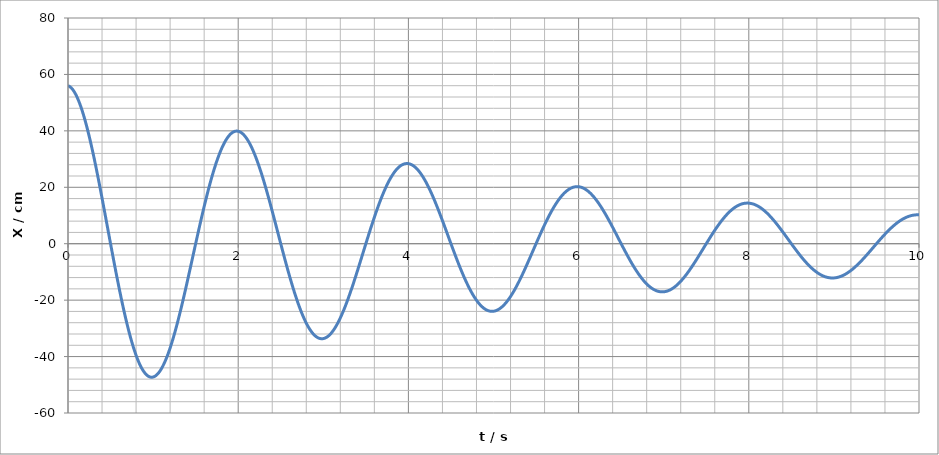
| Category | Series 0 |
|---|---|
| 0.0 | 56 |
| 0.01 | 55.877 |
| 0.02 | 55.7 |
| 0.03 | 55.468 |
| 0.04 | 55.182 |
| 0.05 | 54.842 |
| 0.06 | 54.45 |
| 0.07 | 54.005 |
| 0.08 | 53.508 |
| 0.09 | 52.96 |
| 0.1 | 52.361 |
| 0.11 | 51.713 |
| 0.12 | 51.016 |
| 0.13 | 50.271 |
| 0.14 | 49.479 |
| 0.15 | 48.64 |
| 0.16 | 47.756 |
| 0.17 | 46.828 |
| 0.18 | 45.857 |
| 0.19 | 44.844 |
| 0.2 | 43.79 |
| 0.21 | 42.697 |
| 0.22 | 41.565 |
| 0.23 | 40.395 |
| 0.24 | 39.19 |
| 0.25 | 37.95 |
| 0.26 | 36.677 |
| 0.27 | 35.372 |
| 0.28 | 34.036 |
| 0.29 | 32.672 |
| 0.3 | 31.279 |
| 0.31 | 29.861 |
| 0.32 | 28.418 |
| 0.33 | 26.951 |
| 0.34 | 25.463 |
| 0.35 | 23.955 |
| 0.36 | 22.428 |
| 0.37 | 20.884 |
| 0.38 | 19.325 |
| 0.39 | 17.752 |
| 0.4 | 16.167 |
| 0.41 | 14.572 |
| 0.42 | 12.967 |
| 0.43 | 11.355 |
| 0.44 | 9.737 |
| 0.45 | 8.115 |
| 0.46 | 6.491 |
| 0.47 | 4.865 |
| 0.48 | 3.241 |
| 0.49 | 1.618 |
| 0.5 | 0 |
| 0.51 | -1.613 |
| 0.52 | -3.219 |
| 0.53 | -4.816 |
| 0.54 | -6.403 |
| 0.55 | -7.978 |
| 0.56 | -9.54 |
| 0.57 | -11.088 |
| 0.58 | -12.619 |
| 0.59 | -14.132 |
| 0.6 | -15.627 |
| 0.61 | -17.101 |
| 0.62 | -18.553 |
| 0.63 | -19.981 |
| 0.64 | -21.386 |
| 0.65 | -22.764 |
| 0.66 | -24.115 |
| 0.67 | -25.438 |
| 0.68 | -26.731 |
| 0.69 | -27.993 |
| 0.7 | -29.223 |
| 0.71 | -30.42 |
| 0.72 | -31.583 |
| 0.73 | -32.711 |
| 0.74 | -33.803 |
| 0.75 | -34.858 |
| 0.76 | -35.875 |
| 0.77 | -36.852 |
| 0.78 | -37.79 |
| 0.79 | -38.688 |
| 0.8 | -39.544 |
| 0.81 | -40.358 |
| 0.82 | -41.13 |
| 0.83 | -41.858 |
| 0.84 | -42.543 |
| 0.85 | -43.183 |
| 0.86 | -43.778 |
| 0.87 | -44.328 |
| 0.88 | -44.833 |
| 0.89 | -45.291 |
| 0.9 | -45.703 |
| 0.91 | -46.069 |
| 0.92 | -46.388 |
| 0.93 | -46.659 |
| 0.94 | -46.884 |
| 0.95 | -47.062 |
| 0.96 | -47.193 |
| 0.97 | -47.276 |
| 0.98 | -47.313 |
| 0.99 | -47.302 |
| 1.0 | -47.245 |
| 1.01 | -47.142 |
| 1.02 | -46.992 |
| 1.03 | -46.796 |
| 1.04 | -46.555 |
| 1.05 | -46.269 |
| 1.06 | -45.937 |
| 1.07 | -45.562 |
| 1.08 | -45.143 |
| 1.09 | -44.68 |
| 1.1 | -44.175 |
| 1.11 | -43.629 |
| 1.12 | -43.04 |
| 1.13 | -42.412 |
| 1.14 | -41.743 |
| 1.15 | -41.036 |
| 1.16 | -40.29 |
| 1.17 | -39.508 |
| 1.18 | -38.688 |
| 1.19 | -37.834 |
| 1.2 | -36.944 |
| 1.21 | -36.022 |
| 1.22 | -35.067 |
| 1.23 | -34.08 |
| 1.24 | -33.063 |
| 1.25 | -32.017 |
| 1.26 | -30.943 |
| 1.27 | -29.842 |
| 1.28 | -28.715 |
| 1.29 | -27.564 |
| 1.3 | -26.389 |
| 1.31 | -25.193 |
| 1.32 | -23.975 |
| 1.33 | -22.738 |
| 1.34 | -21.482 |
| 1.35 | -20.21 |
| 1.36 | -18.922 |
| 1.37 | -17.619 |
| 1.38 | -16.304 |
| 1.39 | -14.977 |
| 1.4 | -13.64 |
| 1.41 | -12.294 |
| 1.42 | -10.94 |
| 1.43 | -9.58 |
| 1.44 | -8.215 |
| 1.45 | -6.846 |
| 1.46 | -5.476 |
| 1.47 | -4.105 |
| 1.48 | -2.734 |
| 1.49 | -1.365 |
| 1.5 | 0 |
| 1.51 | 1.361 |
| 1.52 | 2.716 |
| 1.53 | 4.063 |
| 1.54 | 5.402 |
| 1.55 | 6.731 |
| 1.56 | 8.049 |
| 1.57 | 9.354 |
| 1.58 | 10.646 |
| 1.59 | 11.923 |
| 1.6 | 13.184 |
| 1.61 | 14.427 |
| 1.62 | 15.652 |
| 1.63 | 16.858 |
| 1.64 | 18.042 |
| 1.65 | 19.205 |
| 1.66 | 20.345 |
| 1.67 | 21.461 |
| 1.68 | 22.552 |
| 1.69 | 23.617 |
| 1.7 | 24.654 |
| 1.71 | 25.665 |
| 1.72 | 26.646 |
| 1.73 | 27.597 |
| 1.74 | 28.519 |
| 1.75 | 29.408 |
| 1.76 | 30.266 |
| 1.77 | 31.091 |
| 1.78 | 31.882 |
| 1.79 | 32.64 |
| 1.8 | 33.362 |
| 1.81 | 34.049 |
| 1.82 | 34.7 |
| 1.83 | 35.314 |
| 1.84 | 35.892 |
| 1.85 | 36.432 |
| 1.86 | 36.934 |
| 1.87 | 37.398 |
| 1.88 | 37.824 |
| 1.89 | 38.211 |
| 1.9 | 38.558 |
| 1.91 | 38.867 |
| 1.92 | 39.136 |
| 1.93 | 39.365 |
| 1.94 | 39.555 |
| 1.95 | 39.704 |
| 1.96 | 39.815 |
| 1.97 | 39.885 |
| 1.98 | 39.916 |
| 1.99 | 39.907 |
| 2.0 | 39.859 |
| 2.01 | 39.772 |
| 2.02 | 39.645 |
| 2.03 | 39.48 |
| 2.04 | 39.277 |
| 2.05 | 39.035 |
| 2.06 | 38.756 |
| 2.07 | 38.439 |
| 2.08 | 38.085 |
| 2.09 | 37.695 |
| 2.1 | 37.269 |
| 2.11 | 36.808 |
| 2.12 | 36.312 |
| 2.13 | 35.781 |
| 2.14 | 35.217 |
| 2.15 | 34.621 |
| 2.16 | 33.992 |
| 2.17 | 33.331 |
| 2.18 | 32.64 |
| 2.19 | 31.919 |
| 2.2 | 31.169 |
| 2.21 | 30.39 |
| 2.22 | 29.585 |
| 2.23 | 28.752 |
| 2.24 | 27.894 |
| 2.25 | 27.012 |
| 2.26 | 26.106 |
| 2.27 | 25.177 |
| 2.28 | 24.226 |
| 2.29 | 23.255 |
| 2.3 | 22.264 |
| 2.31 | 21.254 |
| 2.32 | 20.227 |
| 2.33 | 19.183 |
| 2.34 | 18.124 |
| 2.35 | 17.05 |
| 2.36 | 15.964 |
| 2.37 | 14.865 |
| 2.38 | 13.755 |
| 2.39 | 12.636 |
| 2.4 | 11.507 |
| 2.41 | 10.372 |
| 2.42 | 9.229 |
| 2.43 | 8.082 |
| 2.44 | 6.931 |
| 2.45 | 5.776 |
| 2.46 | 4.62 |
| 2.47 | 3.463 |
| 2.48 | 2.307 |
| 2.49 | 1.152 |
| 2.5 | 0 |
| 2.51 | -1.148 |
| 2.52 | -2.291 |
| 2.53 | -3.428 |
| 2.54 | -4.557 |
| 2.55 | -5.679 |
| 2.56 | -6.791 |
| 2.57 | -7.892 |
| 2.58 | -8.982 |
| 2.59 | -10.059 |
| 2.6 | -11.123 |
| 2.61 | -12.172 |
| 2.62 | -13.205 |
| 2.63 | -14.222 |
| 2.64 | -15.222 |
| 2.65 | -16.203 |
| 2.66 | -17.164 |
| 2.67 | -18.106 |
| 2.68 | -19.026 |
| 2.69 | -19.924 |
| 2.7 | -20.8 |
| 2.71 | -21.652 |
| 2.72 | -22.48 |
| 2.73 | -23.283 |
| 2.74 | -24.06 |
| 2.75 | -24.811 |
| 2.76 | -25.534 |
| 2.77 | -26.23 |
| 2.78 | -26.898 |
| 2.79 | -27.537 |
| 2.8 | -28.146 |
| 2.81 | -28.726 |
| 2.82 | -29.275 |
| 2.83 | -29.794 |
| 2.84 | -30.281 |
| 2.85 | -30.736 |
| 2.86 | -31.16 |
| 2.87 | -31.552 |
| 2.88 | -31.911 |
| 2.89 | -32.237 |
| 2.9 | -32.53 |
| 2.91 | -32.79 |
| 2.92 | -33.017 |
| 2.93 | -33.211 |
| 2.94 | -33.371 |
| 2.95 | -33.497 |
| 2.96 | -33.59 |
| 2.97 | -33.65 |
| 2.98 | -33.676 |
| 2.99 | -33.668 |
| 3.0 | -33.628 |
| 3.01 | -33.554 |
| 3.02 | -33.447 |
| 3.03 | -33.308 |
| 3.04 | -33.136 |
| 3.05 | -32.933 |
| 3.06 | -32.697 |
| 3.07 | -32.43 |
| 3.08 | -32.131 |
| 3.09 | -31.802 |
| 3.1 | -31.443 |
| 3.11 | -31.054 |
| 3.12 | -30.635 |
| 3.13 | -30.187 |
| 3.14 | -29.712 |
| 3.15 | -29.208 |
| 3.16 | -28.677 |
| 3.17 | -28.12 |
| 3.18 | -27.537 |
| 3.19 | -26.929 |
| 3.2 | -26.296 |
| 3.21 | -25.639 |
| 3.22 | -24.959 |
| 3.23 | -24.257 |
| 3.24 | -23.534 |
| 3.25 | -22.789 |
| 3.26 | -22.024 |
| 3.27 | -21.241 |
| 3.28 | -20.439 |
| 3.29 | -19.619 |
| 3.3 | -18.783 |
| 3.31 | -17.931 |
| 3.32 | -17.065 |
| 3.33 | -16.184 |
| 3.34 | -15.29 |
| 3.35 | -14.385 |
| 3.36 | -13.468 |
| 3.37 | -12.541 |
| 3.38 | -11.605 |
| 3.39 | -10.66 |
| 3.4 | -9.708 |
| 3.41 | -8.75 |
| 3.42 | -7.787 |
| 3.43 | -6.819 |
| 3.44 | -5.847 |
| 3.45 | -4.873 |
| 3.46 | -3.898 |
| 3.47 | -2.922 |
| 3.48 | -1.946 |
| 3.49 | -0.972 |
| 3.5 | 0 |
| 3.51 | 0.969 |
| 3.52 | 1.933 |
| 3.53 | 2.892 |
| 3.54 | 3.845 |
| 3.55 | 4.791 |
| 3.56 | 5.729 |
| 3.57 | 6.658 |
| 3.58 | 7.578 |
| 3.59 | 8.486 |
| 3.6 | 9.384 |
| 3.61 | 10.269 |
| 3.62 | 11.141 |
| 3.63 | 11.999 |
| 3.64 | 12.842 |
| 3.65 | 13.67 |
| 3.66 | 14.481 |
| 3.67 | 15.275 |
| 3.68 | 16.052 |
| 3.69 | 16.81 |
| 3.7 | 17.548 |
| 3.71 | 18.267 |
| 3.72 | 18.966 |
| 3.73 | 19.643 |
| 3.74 | 20.299 |
| 3.75 | 20.932 |
| 3.76 | 21.542 |
| 3.77 | 22.13 |
| 3.78 | 22.693 |
| 3.79 | 23.232 |
| 3.8 | 23.746 |
| 3.81 | 24.235 |
| 3.82 | 24.698 |
| 3.83 | 25.136 |
| 3.84 | 25.547 |
| 3.85 | 25.931 |
| 3.86 | 26.289 |
| 3.87 | 26.619 |
| 3.88 | 26.922 |
| 3.89 | 27.197 |
| 3.9 | 27.445 |
| 3.91 | 27.664 |
| 3.92 | 27.856 |
| 3.93 | 28.019 |
| 3.94 | 28.154 |
| 3.95 | 28.26 |
| 3.96 | 28.339 |
| 3.97 | 28.389 |
| 3.98 | 28.411 |
| 3.99 | 28.405 |
| 4.0 | 28.371 |
| 4.01 | 28.308 |
| 4.02 | 28.218 |
| 4.03 | 28.101 |
| 4.04 | 27.956 |
| 4.05 | 27.784 |
| 4.06 | 27.585 |
| 4.07 | 27.36 |
| 4.08 | 27.108 |
| 4.09 | 26.83 |
| 4.1 | 26.527 |
| 4.11 | 26.199 |
| 4.12 | 25.846 |
| 4.13 | 25.468 |
| 4.14 | 25.067 |
| 4.15 | 24.642 |
| 4.16 | 24.194 |
| 4.17 | 23.724 |
| 4.18 | 23.232 |
| 4.19 | 22.719 |
| 4.2 | 22.185 |
| 4.21 | 21.631 |
| 4.22 | 21.057 |
| 4.23 | 20.465 |
| 4.24 | 19.854 |
| 4.25 | 19.226 |
| 4.26 | 18.581 |
| 4.27 | 17.92 |
| 4.28 | 17.243 |
| 4.29 | 16.552 |
| 4.3 | 15.847 |
| 4.31 | 15.128 |
| 4.32 | 14.397 |
| 4.33 | 13.654 |
| 4.34 | 12.9 |
| 4.35 | 12.136 |
| 4.36 | 11.362 |
| 4.37 | 10.58 |
| 4.38 | 9.791 |
| 4.39 | 8.994 |
| 4.4 | 8.191 |
| 4.41 | 7.382 |
| 4.42 | 6.569 |
| 4.43 | 5.753 |
| 4.44 | 4.933 |
| 4.45 | 4.111 |
| 4.46 | 3.288 |
| 4.47 | 2.465 |
| 4.48 | 1.642 |
| 4.49 | 0.82 |
| 4.5 | 0 |
| 4.51 | -0.817 |
| 4.52 | -1.631 |
| 4.53 | -2.44 |
| 4.54 | -3.244 |
| 4.55 | -4.042 |
| 4.56 | -4.833 |
| 4.57 | -5.617 |
| 4.58 | -6.393 |
| 4.59 | -7.16 |
| 4.6 | -7.917 |
| 4.61 | -8.664 |
| 4.62 | -9.399 |
| 4.63 | -10.123 |
| 4.64 | -10.834 |
| 4.65 | -11.533 |
| 4.66 | -12.217 |
| 4.67 | -12.887 |
| 4.68 | -13.542 |
| 4.69 | -14.182 |
| 4.7 | -14.805 |
| 4.71 | -15.411 |
| 4.72 | -16.001 |
| 4.73 | -16.572 |
| 4.74 | -17.125 |
| 4.75 | -17.66 |
| 4.76 | -18.175 |
| 4.77 | -18.67 |
| 4.78 | -19.145 |
| 4.79 | -19.6 |
| 4.8 | -20.034 |
| 4.81 | -20.446 |
| 4.82 | -20.837 |
| 4.83 | -21.206 |
| 4.84 | -21.553 |
| 4.85 | -21.877 |
| 4.86 | -22.179 |
| 4.87 | -22.458 |
| 4.88 | -22.713 |
| 4.89 | -22.945 |
| 4.9 | -23.154 |
| 4.91 | -23.339 |
| 4.92 | -23.501 |
| 4.93 | -23.638 |
| 4.94 | -23.752 |
| 4.95 | -23.842 |
| 4.96 | -23.909 |
| 4.97 | -23.951 |
| 4.98 | -23.969 |
| 4.99 | -23.964 |
| 5.0 | -23.935 |
| 5.01 | -23.883 |
| 5.02 | -23.807 |
| 5.03 | -23.708 |
| 5.04 | -23.586 |
| 5.05 | -23.44 |
| 5.06 | -23.273 |
| 5.07 | -23.082 |
| 5.08 | -22.87 |
| 5.09 | -22.636 |
| 5.1 | -22.38 |
| 5.11 | -22.103 |
| 5.12 | -21.805 |
| 5.13 | -21.487 |
| 5.14 | -21.148 |
| 5.15 | -20.79 |
| 5.16 | -20.412 |
| 5.17 | -20.015 |
| 5.18 | -19.6 |
| 5.19 | -19.167 |
| 5.2 | -18.717 |
| 5.21 | -18.249 |
| 5.22 | -17.765 |
| 5.23 | -17.266 |
| 5.24 | -16.75 |
| 5.25 | -16.221 |
| 5.26 | -15.676 |
| 5.27 | -15.119 |
| 5.28 | -14.548 |
| 5.29 | -13.964 |
| 5.3 | -13.369 |
| 5.31 | -12.763 |
| 5.32 | -12.146 |
| 5.33 | -11.519 |
| 5.34 | -10.883 |
| 5.35 | -10.239 |
| 5.36 | -9.586 |
| 5.37 | -8.926 |
| 5.38 | -8.26 |
| 5.39 | -7.588 |
| 5.4 | -6.91 |
| 5.41 | -6.228 |
| 5.42 | -5.542 |
| 5.43 | -4.853 |
| 5.44 | -4.162 |
| 5.45 | -3.469 |
| 5.46 | -2.774 |
| 5.47 | -2.08 |
| 5.48 | -1.385 |
| 5.49 | -0.692 |
| 5.5 | 0 |
| 5.51 | 0.689 |
| 5.52 | 1.376 |
| 5.53 | 2.058 |
| 5.54 | 2.737 |
| 5.55 | 3.41 |
| 5.56 | 4.078 |
| 5.57 | 4.739 |
| 5.58 | 5.394 |
| 5.59 | 6.04 |
| 5.6 | 6.679 |
| 5.61 | 7.309 |
| 5.62 | 7.93 |
| 5.63 | 8.54 |
| 5.64 | 9.141 |
| 5.65 | 9.73 |
| 5.66 | 10.307 |
| 5.67 | 10.872 |
| 5.68 | 11.425 |
| 5.69 | 11.965 |
| 5.7 | 12.49 |
| 5.71 | 13.002 |
| 5.72 | 13.499 |
| 5.73 | 13.981 |
| 5.74 | 14.448 |
| 5.75 | 14.899 |
| 5.76 | 15.333 |
| 5.77 | 15.751 |
| 5.78 | 16.152 |
| 5.79 | 16.536 |
| 5.8 | 16.902 |
| 5.81 | 17.25 |
| 5.82 | 17.58 |
| 5.83 | 17.891 |
| 5.84 | 18.183 |
| 5.85 | 18.457 |
| 5.86 | 18.712 |
| 5.87 | 18.947 |
| 5.88 | 19.162 |
| 5.89 | 19.358 |
| 5.9 | 19.534 |
| 5.91 | 19.69 |
| 5.92 | 19.827 |
| 5.93 | 19.943 |
| 5.94 | 20.039 |
| 5.95 | 20.115 |
| 5.96 | 20.171 |
| 5.97 | 20.206 |
| 5.98 | 20.222 |
| 5.99 | 20.218 |
| 6.0 | 20.193 |
| 6.01 | 20.149 |
| 6.02 | 20.085 |
| 6.03 | 20.001 |
| 6.04 | 19.898 |
| 6.05 | 19.776 |
| 6.06 | 19.634 |
| 6.07 | 19.474 |
| 6.08 | 19.295 |
| 6.09 | 19.097 |
| 6.1 | 18.881 |
| 6.11 | 18.648 |
| 6.12 | 18.396 |
| 6.13 | 18.127 |
| 6.14 | 17.842 |
| 6.15 | 17.539 |
| 6.16 | 17.221 |
| 6.17 | 16.886 |
| 6.18 | 16.536 |
| 6.19 | 16.171 |
| 6.2 | 15.791 |
| 6.21 | 15.396 |
| 6.22 | 14.988 |
| 6.23 | 14.566 |
| 6.24 | 14.132 |
| 6.25 | 13.685 |
| 6.26 | 13.226 |
| 6.27 | 12.755 |
| 6.28 | 12.273 |
| 6.29 | 11.781 |
| 6.3 | 11.279 |
| 6.31 | 10.768 |
| 6.32 | 10.247 |
| 6.33 | 9.718 |
| 6.34 | 9.182 |
| 6.35 | 8.638 |
| 6.36 | 8.087 |
| 6.37 | 7.531 |
| 6.38 | 6.969 |
| 6.39 | 6.401 |
| 6.4 | 5.83 |
| 6.41 | 5.254 |
| 6.42 | 4.676 |
| 6.43 | 4.095 |
| 6.44 | 3.511 |
| 6.45 | 2.926 |
| 6.46 | 2.341 |
| 6.47 | 1.754 |
| 6.48 | 1.169 |
| 6.49 | 0.584 |
| 6.5 | 0 |
| 6.51 | -0.582 |
| 6.52 | -1.161 |
| 6.53 | -1.737 |
| 6.54 | -2.309 |
| 6.55 | -2.877 |
| 6.56 | -3.44 |
| 6.57 | -3.998 |
| 6.58 | -4.55 |
| 6.59 | -5.096 |
| 6.6 | -5.635 |
| 6.61 | -6.166 |
| 6.62 | -6.69 |
| 6.63 | -7.205 |
| 6.64 | -7.712 |
| 6.65 | -8.209 |
| 6.66 | -8.696 |
| 6.67 | -9.173 |
| 6.68 | -9.639 |
| 6.69 | -10.094 |
| 6.7 | -10.538 |
| 6.71 | -10.969 |
| 6.72 | -11.389 |
| 6.73 | -11.796 |
| 6.74 | -12.189 |
| 6.75 | -12.57 |
| 6.76 | -12.936 |
| 6.77 | -13.289 |
| 6.78 | -13.627 |
| 6.79 | -13.951 |
| 6.8 | -14.259 |
| 6.81 | -14.553 |
| 6.82 | -14.831 |
| 6.83 | -15.094 |
| 6.84 | -15.341 |
| 6.85 | -15.572 |
| 6.86 | -15.786 |
| 6.87 | -15.985 |
| 6.88 | -16.166 |
| 6.89 | -16.332 |
| 6.9 | -16.48 |
| 6.91 | -16.612 |
| 6.92 | -16.727 |
| 6.93 | -16.825 |
| 6.94 | -16.906 |
| 6.95 | -16.97 |
| 6.96 | -17.017 |
| 6.97 | -17.048 |
| 6.98 | -17.061 |
| 6.99 | -17.057 |
| 7.0 | -17.036 |
| 7.01 | -16.999 |
| 7.02 | -16.945 |
| 7.03 | -16.875 |
| 7.04 | -16.788 |
| 7.05 | -16.684 |
| 7.06 | -16.565 |
| 7.07 | -16.429 |
| 7.08 | -16.278 |
| 7.09 | -16.112 |
| 7.1 | -15.929 |
| 7.11 | -15.732 |
| 7.12 | -15.52 |
| 7.13 | -15.293 |
| 7.14 | -15.052 |
| 7.15 | -14.797 |
| 7.16 | -14.529 |
| 7.17 | -14.246 |
| 7.18 | -13.951 |
| 7.19 | -13.643 |
| 7.2 | -13.322 |
| 7.21 | -12.989 |
| 7.22 | -12.645 |
| 7.23 | -12.289 |
| 7.24 | -11.922 |
| 7.25 | -11.545 |
| 7.26 | -11.158 |
| 7.27 | -10.761 |
| 7.28 | -10.355 |
| 7.29 | -9.939 |
| 7.3 | -9.516 |
| 7.31 | -9.084 |
| 7.32 | -8.645 |
| 7.33 | -8.199 |
| 7.34 | -7.746 |
| 7.35 | -7.288 |
| 7.36 | -6.823 |
| 7.37 | -6.353 |
| 7.38 | -5.879 |
| 7.39 | -5.401 |
| 7.4 | -4.918 |
| 7.41 | -4.433 |
| 7.42 | -3.945 |
| 7.43 | -3.454 |
| 7.44 | -2.962 |
| 7.45 | -2.469 |
| 7.46 | -1.975 |
| 7.47 | -1.48 |
| 7.48 | -0.986 |
| 7.49 | -0.492 |
| 7.5 | 0 |
| 7.51 | 0.491 |
| 7.52 | 0.979 |
| 7.53 | 1.465 |
| 7.54 | 1.948 |
| 7.55 | 2.427 |
| 7.56 | 2.902 |
| 7.57 | 3.373 |
| 7.58 | 3.839 |
| 7.59 | 4.299 |
| 7.6 | 4.754 |
| 7.61 | 5.202 |
| 7.62 | 5.644 |
| 7.63 | 6.079 |
| 7.64 | 6.506 |
| 7.65 | 6.925 |
| 7.66 | 7.336 |
| 7.67 | 7.739 |
| 7.68 | 8.132 |
| 7.69 | 8.516 |
| 7.7 | 8.89 |
| 7.71 | 9.254 |
| 7.72 | 9.608 |
| 7.73 | 9.951 |
| 7.74 | 10.284 |
| 7.75 | 10.604 |
| 7.76 | 10.914 |
| 7.77 | 11.211 |
| 7.78 | 11.497 |
| 7.79 | 11.77 |
| 7.8 | 12.03 |
| 7.81 | 12.278 |
| 7.82 | 12.513 |
| 7.83 | 12.734 |
| 7.84 | 12.942 |
| 7.85 | 13.137 |
| 7.86 | 13.318 |
| 7.87 | 13.486 |
| 7.88 | 13.639 |
| 7.89 | 13.779 |
| 7.9 | 13.904 |
| 7.91 | 14.015 |
| 7.92 | 14.112 |
| 7.93 | 14.195 |
| 7.94 | 14.263 |
| 7.95 | 14.317 |
| 7.96 | 14.357 |
| 7.97 | 14.382 |
| 7.98 | 14.393 |
| 7.99 | 14.39 |
| 8.0 | 14.373 |
| 8.01 | 14.342 |
| 8.02 | 14.296 |
| 8.03 | 14.236 |
| 8.04 | 14.163 |
| 8.05 | 14.076 |
| 8.06 | 13.975 |
| 8.07 | 13.861 |
| 8.08 | 13.733 |
| 8.09 | 13.593 |
| 8.1 | 13.439 |
| 8.11 | 13.273 |
| 8.12 | 13.094 |
| 8.13 | 12.903 |
| 8.14 | 12.699 |
| 8.15 | 12.484 |
| 8.16 | 12.257 |
| 8.17 | 12.019 |
| 8.18 | 11.77 |
| 8.19 | 11.51 |
| 8.2 | 11.239 |
| 8.21 | 10.959 |
| 8.22 | 10.668 |
| 8.23 | 10.368 |
| 8.24 | 10.059 |
| 8.25 | 9.74 |
| 8.26 | 9.414 |
| 8.27 | 9.079 |
| 8.28 | 8.736 |
| 8.29 | 8.386 |
| 8.3 | 8.028 |
| 8.31 | 7.664 |
| 8.32 | 7.294 |
| 8.33 | 6.917 |
| 8.34 | 6.535 |
| 8.35 | 6.148 |
| 8.36 | 5.756 |
| 8.37 | 5.36 |
| 8.38 | 4.96 |
| 8.39 | 4.556 |
| 8.4 | 4.15 |
| 8.41 | 3.74 |
| 8.42 | 3.328 |
| 8.43 | 2.914 |
| 8.44 | 2.499 |
| 8.45 | 2.083 |
| 8.46 | 1.666 |
| 8.47 | 1.249 |
| 8.48 | 0.832 |
| 8.49 | 0.415 |
| 8.5 | 0 |
| 8.51 | -0.414 |
| 8.52 | -0.826 |
| 8.53 | -1.236 |
| 8.54 | -1.643 |
| 8.55 | -2.048 |
| 8.56 | -2.449 |
| 8.57 | -2.846 |
| 8.58 | -3.239 |
| 8.59 | -3.627 |
| 8.6 | -4.011 |
| 8.61 | -4.389 |
| 8.62 | -4.762 |
| 8.63 | -5.128 |
| 8.64 | -5.489 |
| 8.65 | -5.843 |
| 8.66 | -6.189 |
| 8.67 | -6.529 |
| 8.68 | -6.861 |
| 8.69 | -7.185 |
| 8.7 | -7.5 |
| 8.71 | -7.808 |
| 8.72 | -8.106 |
| 8.73 | -8.396 |
| 8.74 | -8.676 |
| 8.75 | -8.947 |
| 8.76 | -9.208 |
| 8.77 | -9.459 |
| 8.78 | -9.699 |
| 8.79 | -9.93 |
| 8.8 | -10.149 |
| 8.81 | -10.358 |
| 8.82 | -10.556 |
| 8.83 | -10.743 |
| 8.84 | -10.919 |
| 8.85 | -11.083 |
| 8.86 | -11.236 |
| 8.87 | -11.377 |
| 8.88 | -11.507 |
| 8.89 | -11.624 |
| 8.9 | -11.73 |
| 8.91 | -11.824 |
| 8.92 | -11.906 |
| 8.93 | -11.976 |
| 8.94 | -12.033 |
| 8.95 | -12.079 |
| 8.96 | -12.112 |
| 8.97 | -12.134 |
| 8.98 | -12.143 |
| 8.99 | -12.141 |
| 9.0 | -12.126 |
| 9.01 | -12.099 |
| 9.02 | -12.061 |
| 9.03 | -12.011 |
| 9.04 | -11.949 |
| 9.05 | -11.875 |
| 9.06 | -11.79 |
| 9.07 | -11.694 |
| 9.08 | -11.586 |
| 9.09 | -11.468 |
| 9.1 | -11.338 |
| 9.11 | -11.198 |
| 9.12 | -11.047 |
| 9.13 | -10.885 |
| 9.14 | -10.714 |
| 9.15 | -10.532 |
| 9.16 | -10.341 |
| 9.17 | -10.14 |
| 9.18 | -9.93 |
| 9.19 | -9.71 |
| 9.2 | -9.482 |
| 9.21 | -9.245 |
| 9.22 | -9 |
| 9.23 | -8.747 |
| 9.24 | -8.486 |
| 9.25 | -8.218 |
| 9.26 | -7.942 |
| 9.27 | -7.659 |
| 9.28 | -7.37 |
| 9.29 | -7.075 |
| 9.3 | -6.773 |
| 9.31 | -6.466 |
| 9.32 | -6.153 |
| 9.33 | -5.836 |
| 9.34 | -5.514 |
| 9.35 | -5.187 |
| 9.36 | -4.856 |
| 9.37 | -4.522 |
| 9.38 | -4.185 |
| 9.39 | -3.844 |
| 9.4 | -3.501 |
| 9.41 | -3.155 |
| 9.42 | -2.808 |
| 9.43 | -2.459 |
| 9.44 | -2.108 |
| 9.45 | -1.757 |
| 9.46 | -1.405 |
| 9.47 | -1.054 |
| 9.48 | -0.702 |
| 9.49 | -0.35 |
| 9.5 | 0 |
| 9.51 | 0.349 |
| 9.52 | 0.697 |
| 9.53 | 1.043 |
| 9.54 | 1.386 |
| 9.55 | 1.728 |
| 9.56 | 2.066 |
| 9.57 | 2.401 |
| 9.58 | 2.732 |
| 9.59 | 3.06 |
| 9.6 | 3.384 |
| 9.61 | 3.703 |
| 9.62 | 4.017 |
| 9.63 | 4.327 |
| 9.64 | 4.631 |
| 9.65 | 4.929 |
| 9.66 | 5.222 |
| 9.67 | 5.508 |
| 9.68 | 5.788 |
| 9.69 | 6.061 |
| 9.7 | 6.328 |
| 9.71 | 6.587 |
| 9.72 | 6.839 |
| 9.73 | 7.083 |
| 9.74 | 7.32 |
| 9.75 | 7.548 |
| 9.76 | 7.768 |
| 9.77 | 7.98 |
| 9.78 | 8.183 |
| 9.79 | 8.377 |
| 9.8 | 8.563 |
| 9.81 | 8.739 |
| 9.82 | 8.906 |
| 9.83 | 9.064 |
| 9.84 | 9.212 |
| 9.85 | 9.351 |
| 9.86 | 9.48 |
| 9.87 | 9.599 |
| 9.88 | 9.708 |
| 9.89 | 9.807 |
| 9.9 | 9.896 |
| 9.91 | 9.976 |
| 9.92 | 10.045 |
| 9.93 | 10.103 |
| 9.94 | 10.152 |
| 9.95 | 10.191 |
| 9.96 | 10.219 |
| 9.97 | 10.237 |
| 9.98 | 10.245 |
| 9.99 | 10.243 |
| 10.0 | 10.23 |